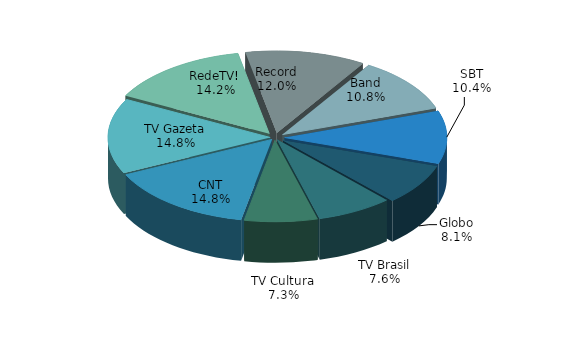
| Category | Series 0 |
|---|---|
| CNT | 0.148 |
| TV Gazeta | 0.148 |
| RedeTV! | 0.142 |
| Record | 0.12 |
| Band | 0.108 |
| SBT | 0.104 |
| Globo | 0.081 |
| TV Brasil | 0.076 |
| TV Cultura | 0.073 |